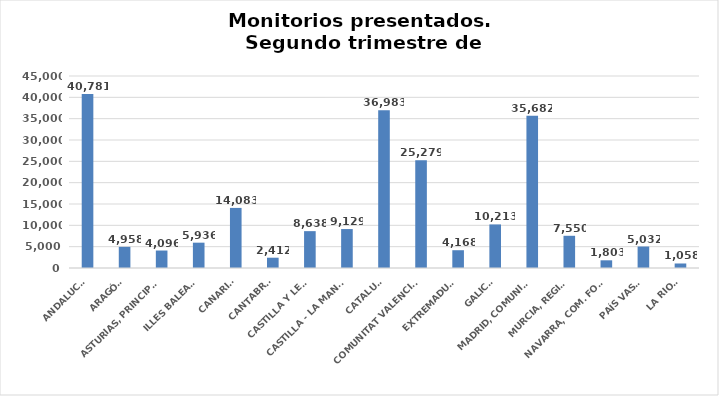
| Category | Series 0 |
|---|---|
| ANDALUCÍA | 40781 |
| ARAGÓN | 4958 |
| ASTURIAS, PRINCIPADO | 4096 |
| ILLES BALEARS | 5936 |
| CANARIAS | 14083 |
| CANTABRIA | 2412 |
| CASTILLA Y LEÓN | 8638 |
| CASTILLA - LA MANCHA | 9129 |
| CATALUÑA | 36983 |
| COMUNITAT VALENCIANA | 25279 |
| EXTREMADURA | 4168 |
| GALICIA | 10213 |
| MADRID, COMUNIDAD | 35682 |
| MURCIA, REGIÓN | 7550 |
| NAVARRA, COM. FORAL | 1803 |
| PAÍS VASCO | 5032 |
| LA RIOJA | 1058 |